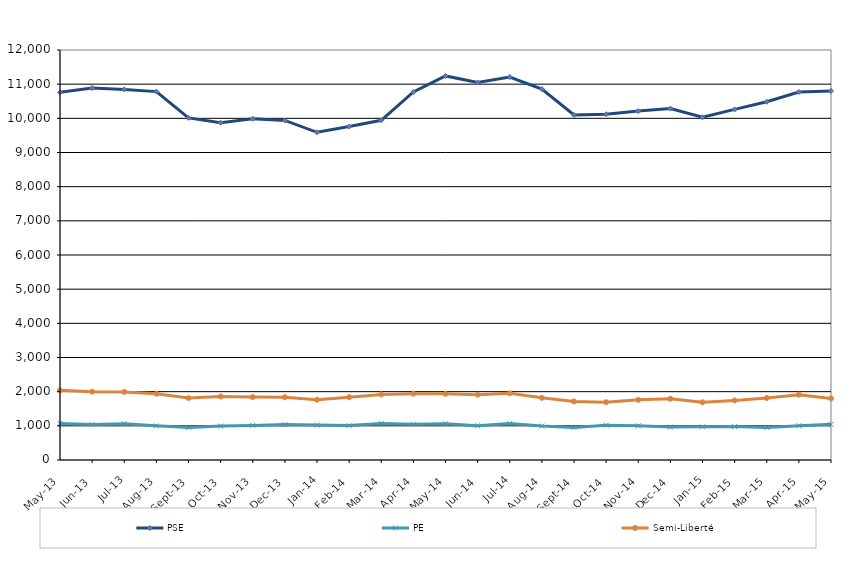
| Category | PSE | PE | Semi-Liberté |
|---|---|---|---|
| 2013-05-01 | 10760 | 1070 | 2041 |
| 2013-06-01 | 10886 | 1038 | 2000 |
| 2013-07-01 | 10846 | 1061 | 1993 |
| 2013-08-01 | 10782 | 999 | 1939 |
| 2013-09-01 | 10013 | 954 | 1813 |
| 2013-10-01 | 9874 | 993 | 1860 |
| 2013-11-01 | 9987 | 1013 | 1842 |
| 2013-12-01 | 9938 | 1037 | 1838 |
| 2014-01-01 | 9591 | 1022 | 1765 |
| 2014-02-01 | 9760 | 1007 | 1838 |
| 2014-03-01 | 9943 | 1071 | 1920 |
| 2014-04-01 | 10773 | 1050 | 1942 |
| 2014-05-01 | 11241 | 1062 | 1937 |
| 2014-06-01 | 11048 | 1005 | 1912 |
| 2014-07-01 | 11210 | 1068 | 1951 |
| 2014-08-01 | 10856 | 992 | 1820 |
| 2014-09-01 | 10098 | 951 | 1714 |
| 2014-10-01 | 10120 | 1018 | 1692 |
| 2014-11-01 | 10213 | 1000 | 1760 |
| 2014-12-01 | 10287 | 966 | 1794 |
| 2015-01-01 | 10030 | 970 | 1689 |
| 2015-02-01 | 10261 | 977 | 1743 |
| 2015-03-01 | 10485 | 954 | 1814 |
| 2015-04-01 | 10770 | 1003 | 1912 |
| 2015-05-01 | 10801 | 1043 | 1803 |